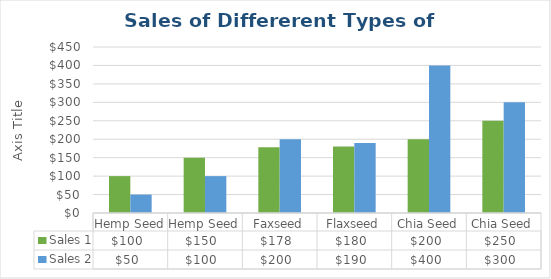
| Category | Sales 1 | Sales 2 |
|---|---|---|
| Hemp Seed | 100 | 50 |
| Hemp Seed | 150 | 100 |
| Faxseed | 178 | 200 |
| Flaxseed | 180 | 190 |
| Chia Seed | 200 | 400 |
| Chia Seed | 250 | 300 |